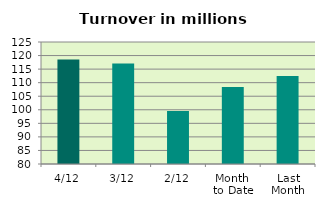
| Category | Series 0 |
|---|---|
| 4/12 | 118.58 |
| 3/12 | 117.114 |
| 2/12 | 99.524 |
| Month 
to Date | 108.438 |
| Last
Month | 112.501 |